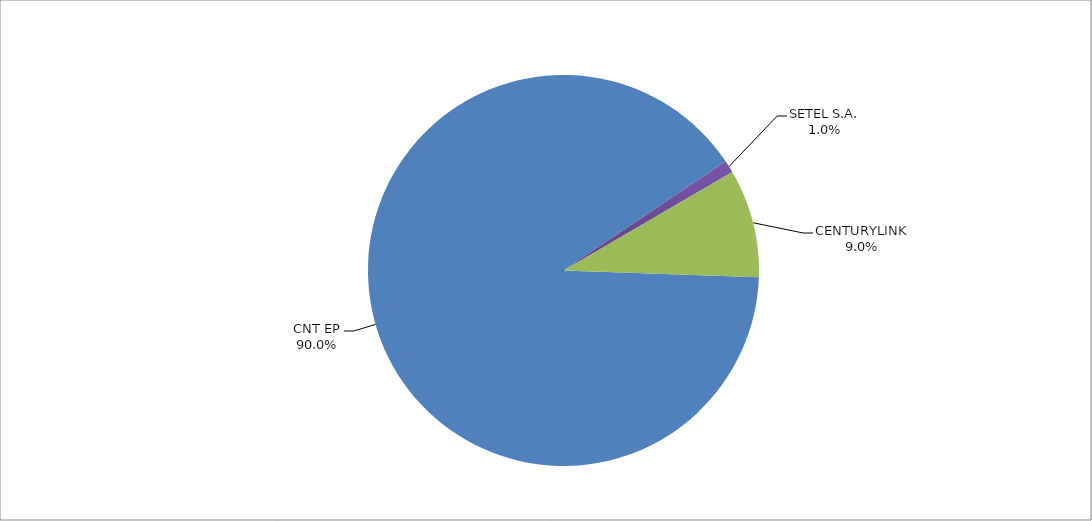
| Category | Series 0 |
|---|---|
| CNT EP | 261 |
| SETEL S.A. | 3 |
| CENTURYLINK | 26 |